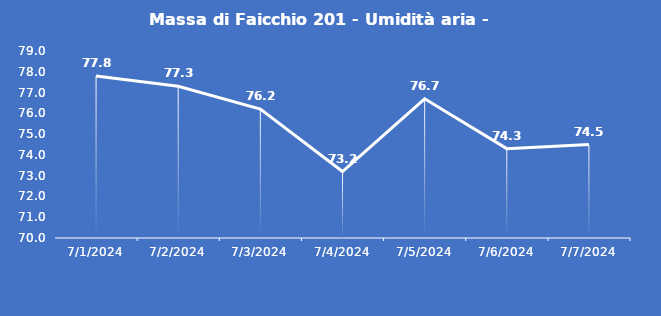
| Category | Massa di Faicchio 201 - Umidità aria - Grezzo (%) |
|---|---|
| 7/1/24 | 77.8 |
| 7/2/24 | 77.3 |
| 7/3/24 | 76.2 |
| 7/4/24 | 73.2 |
| 7/5/24 | 76.7 |
| 7/6/24 | 74.3 |
| 7/7/24 | 74.5 |